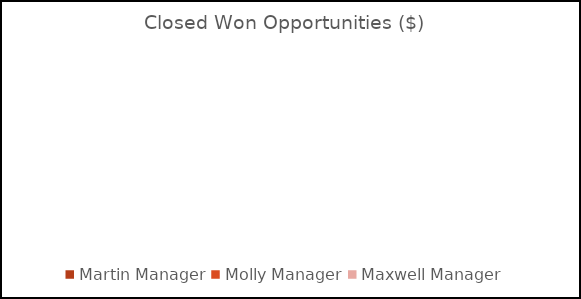
| Category | Closed Won Opportunities  |
|---|---|
| Martin Manager | 0 |
| Molly Manager | 0 |
| Maxwell Manager  | 0 |